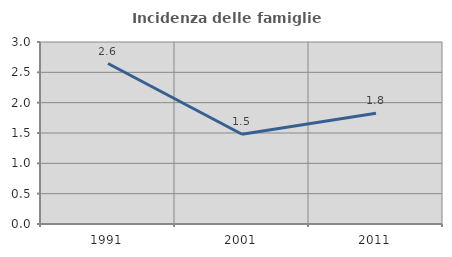
| Category | Incidenza delle famiglie numerose |
|---|---|
| 1991.0 | 2.646 |
| 2001.0 | 1.48 |
| 2011.0 | 1.827 |